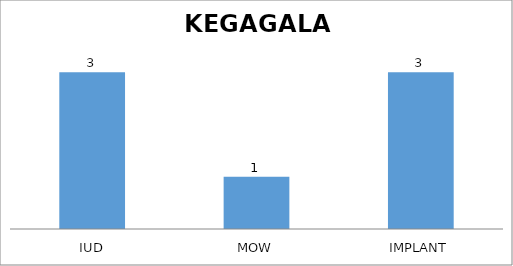
| Category | KEGAGALAN |
|---|---|
| IUD | 3 |
| MOW | 1 |
| IMPLANT | 3 |